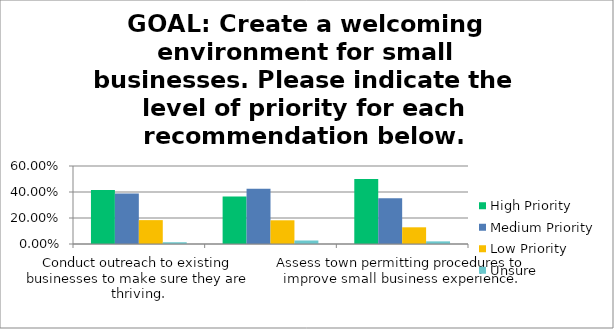
| Category | High Priority | Medium Priority | Low Priority | Unsure |
|---|---|---|---|---|
| Conduct outreach to existing businesses to make sure they are thriving. | 0.415 | 0.388 | 0.184 | 0.014 |
| Establish a working partnership with East of the River Five Towns Chamber to assist aspiring entrepreneurs and existing small businesses. | 0.365 | 0.426 | 0.182 | 0.027 |
| Assess town permitting procedures to improve small business experience. | 0.5 | 0.351 | 0.128 | 0.02 |